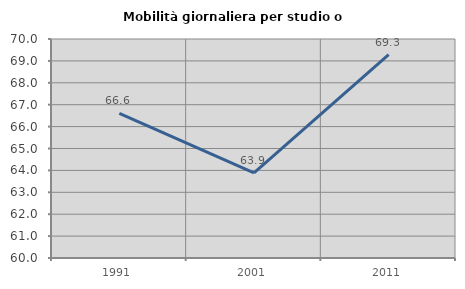
| Category | Mobilità giornaliera per studio o lavoro |
|---|---|
| 1991.0 | 66.607 |
| 2001.0 | 63.891 |
| 2011.0 | 69.281 |